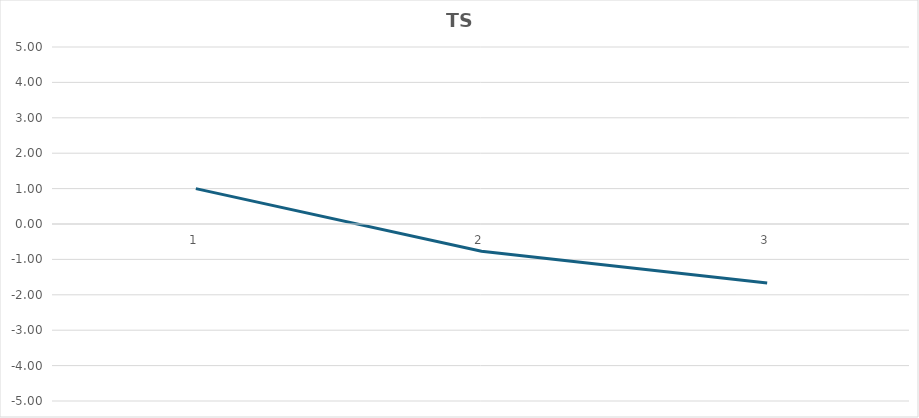
| Category | TS |
|---|---|
| 0 | 1 |
| 1 | -0.771 |
| 2 | -1.669 |